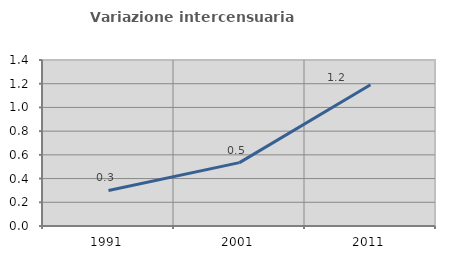
| Category | Variazione intercensuaria annua |
|---|---|
| 1991.0 | 0.3 |
| 2001.0 | 0.534 |
| 2011.0 | 1.192 |